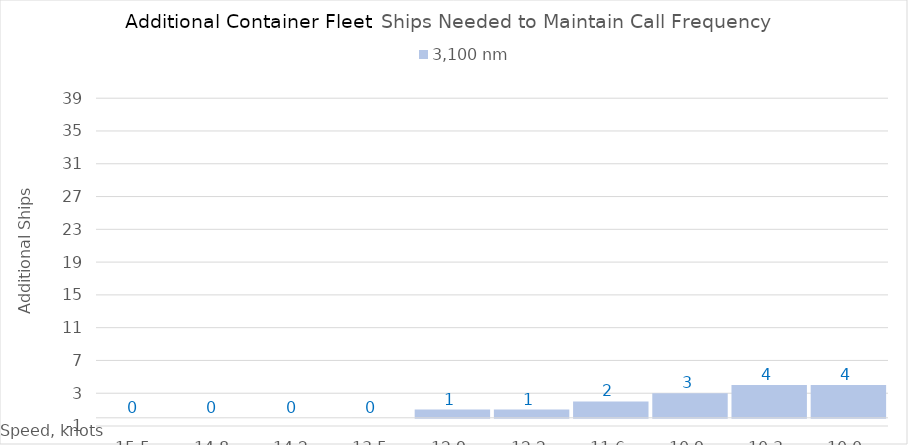
| Category | 3,100 |
|---|---|
| 15.450000000000001 | 0 |
| 14.8 | 0 |
| 14.15 | 0 |
| 13.5 | 0 |
| 12.85 | 1 |
| 12.2 | 1 |
| 11.549999999999999 | 2 |
| 10.899999999999999 | 3 |
| 10.249999999999998 | 4 |
| 10.0 | 4 |